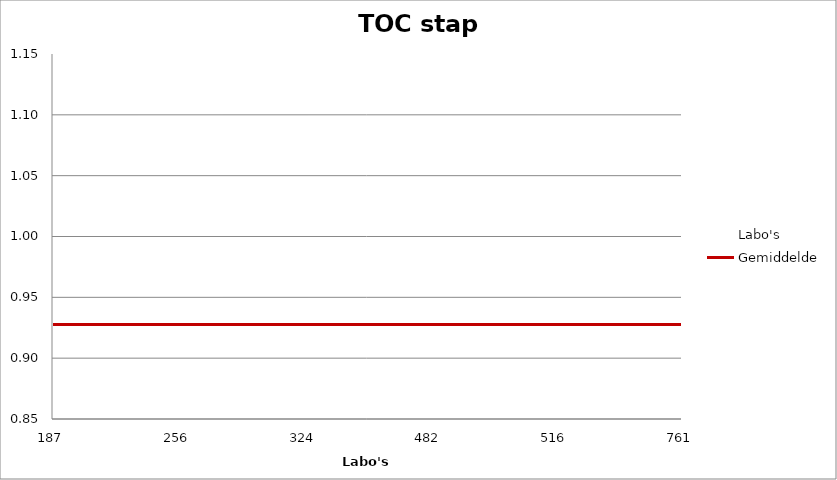
| Category | Labo's | Gemiddelde |
|---|---|---|
| 187.0 | 0.88 | 0.928 |
| 256.0 | 0.89 | 0.928 |
| 324.0 | 0.89 | 0.928 |
| 482.0 | 1.13 | 0.928 |
| 516.0 | 0.94 | 0.928 |
| 761.0 | 0.95 | 0.928 |